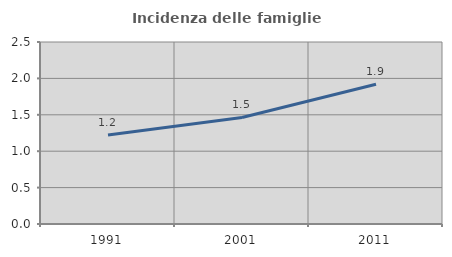
| Category | Incidenza delle famiglie numerose |
|---|---|
| 1991.0 | 1.223 |
| 2001.0 | 1.463 |
| 2011.0 | 1.921 |